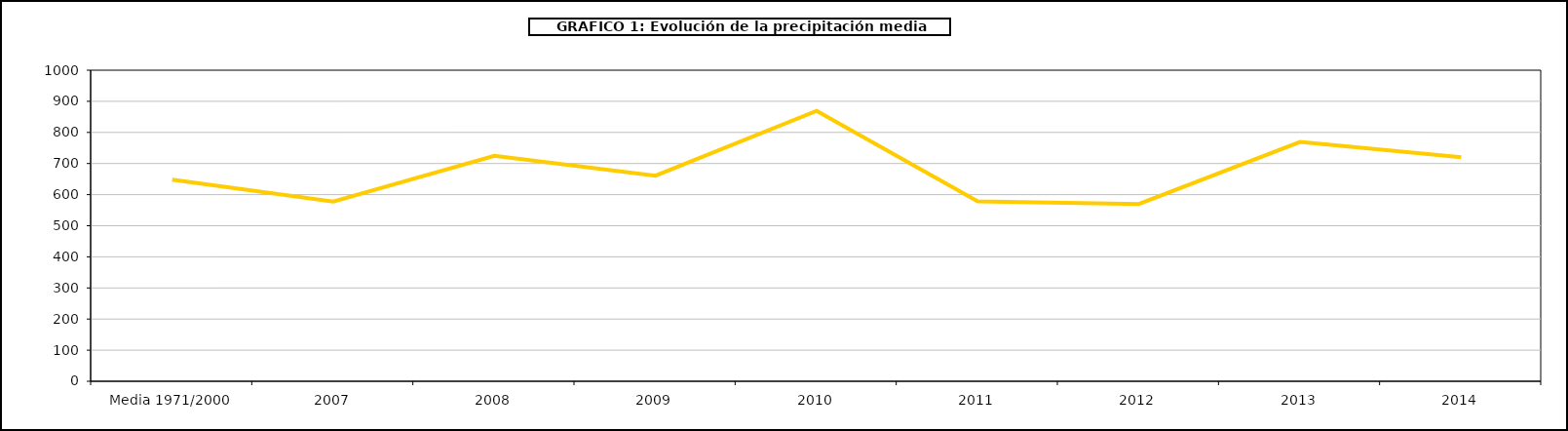
| Category | Series 0 |
|---|---|
| 0 | 648 |
| 1 | 578 |
| 2 | 725 |
| 3 | 661 |
| 4 | 869.377 |
| 5 | 578.444 |
| 6 | 570.1 |
| 7 | 769.551 |
| 8 | 720.348 |